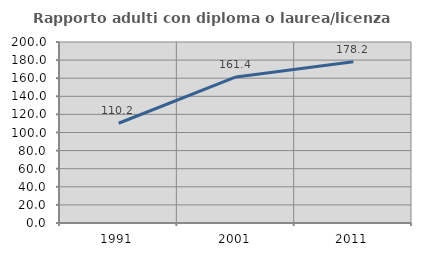
| Category | Rapporto adulti con diploma o laurea/licenza media  |
|---|---|
| 1991.0 | 110.228 |
| 2001.0 | 161.436 |
| 2011.0 | 178.168 |